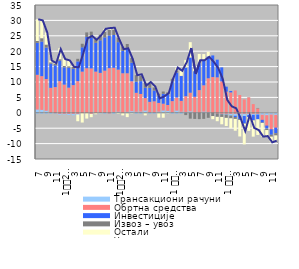
| Category | Трансакциони рачуни | Обртна средства | Инвестиције | Извоз – увоз | Остали |
|---|---|---|---|---|---|
| 7 | 1.353 | 10.986 | 10.377 | 0.593 | 7.056 |
| 8 | 1.265 | 10.637 | 11.223 | 1.094 | 5.781 |
| 9 | 0.976 | 9.997 | 10.221 | 0.953 | 3.925 |
| 10 | 0.379 | 7.724 | 7.847 | 0.429 | 0.607 |
| 11 | 0.192 | 8.158 | 7.073 | 0.417 | 0.272 |
| 12 | -0.293 | 10.273 | 6.654 | 0.455 | 3.593 |
| 1
2010. | -0.221 | 9.157 | 5.613 | 0.419 | 2.449 |
| 2 | -0.393 | 8.165 | 6.485 | 0.467 | 2.306 |
| 3 | -0.493 | 8.992 | 5.273 | 0.708 | 0.397 |
| 4 | -0.564 | 10.278 | 6.415 | 0.838 | -2.174 |
| 5 | -0.057 | 13.37 | 7.9 | 1.153 | -3.112 |
| 6 | 0.019 | 14.454 | 10.125 | 1.506 | -1.877 |
| 7 | -0.36 | 14.41 | 9.979 | 1.962 | -1.059 |
| 8 | 0.024 | 13.353 | 9.353 | 1.442 | -0.48 |
| 9 | 0.263 | 12.702 | 10.569 | 1.826 | -0.168 |
| 10 | 0.319 | 13.358 | 10.812 | 1.869 | 0.913 |
| 11 | 0.095 | 14.393 | 10.6 | 1.804 | 0.623 |
| 12 | 0.559 | 14.05 | 10.655 | 1.796 | 0.56 |
| 1
2011. | 0.65 | 13.368 | 8.925 | 1.366 | -0.4 |
| 2 | 0.114 | 12.724 | 7.25 | 1.403 | -0.847 |
| 3 | 0.627 | 12.209 | 8.254 | 1.255 | -1.401 |
| 4 | 0.84 | 9.401 | 6.032 | 1.498 | -0.295 |
| 5 | 0.654 | 5.836 | 3.602 | 2.132 | -0.006 |
| 6 | 0.701 | 5.415 | 4.154 | 1.787 | 0.44 |
| 7 | 1.03 | 3.749 | 3.336 | 1.553 | -0.839 |
| 8 | 0.481 | 3.064 | 4.565 | 1.487 | 0.383 |
| 9 | 0.441 | 3.291 | 3.485 | 1.091 | 0.263 |
| 10 | 0.672 | 2.531 | 2.291 | 0.741 | -1.562 |
| 11 | 1.053 | 1.901 | 3.202 | 0.76 | -1.598 |
| 12 | 0.933 | 1.604 | 3.492 | 0.623 | -0.273 |
| 1 
2012. | 0.51 | 3.284 | 6.394 | 0.938 | 0.06 |
| 2 | 1.015 | 3.957 | 8.084 | 0.64 | 1 |
| 3 | 0.654 | 3.221 | 8.062 | 0.073 | 1.645 |
| 4 | 0.588 | 4.788 | 9.36 | -0.743 | 2.44 |
| 5 | 0.764 | 5.758 | 11.436 | -1.9 | 4.975 |
| 6 | 0.352 | 4.856 | 8.304 | -1.99 | 1.088 |
| 7 | 0.31 | 7.061 | 8.719 | -2.054 | 3.018 |
| 8 | 0.685 | 8.244 | 8.046 | -1.973 | 2.094 |
| 9 | 0.481 | 10.73 | 7.074 | -1.632 | 1.508 |
| 10 | 0.249 | 11.353 | 7.026 | -1.069 | -1.007 |
| 11 | -0.243 | 11.51 | 5.741 | -1.076 | -1.411 |
| 12 | -0.455 | 10.215 | 4.528 | -0.891 | -2.385 |
| 1 
2013. | -0.556 | 6.871 | 1.614 | -1.09 | -2.643 |
| 2 | -0.872 | 6.619 | 0.475 | -0.931 | -3.188 |
| 3 | -0.957 | 7.261 | -0.411 | -0.622 | -3.83 |
| 4 | -0.95 | 5.775 | -1.106 | -0.289 | -5.334 |
| 5 | -1.043 | 4.342 | -2.391 | -0.116 | -6.713 |
| 6 | -0.729 | 5.025 | -0.665 | 0.069 | -4.486 |
| 7 | -0.661 | 2.821 | -1.725 | -0.107 | -5.247 |
| 8 | -0.572 | 1.428 | -1.539 | 0.146 | -5.079 |
| 9 | -0.612 | -1.671 | -0.885 | -0.141 | -4.417 |
| 10 | -0.76 | -3.385 | -0.964 | -0.498 | -1.945 |
| 11 | -0.558 | -4.789 | -1.78 | -0.636 | -1.83 |
| 12 | -0.653 | -4.164 | -1.804 | -0.732 | -1.693 |